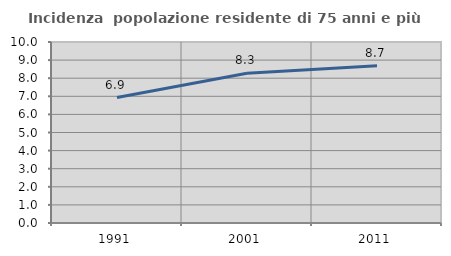
| Category | Incidenza  popolazione residente di 75 anni e più |
|---|---|
| 1991.0 | 6.93 |
| 2001.0 | 8.27 |
| 2011.0 | 8.689 |